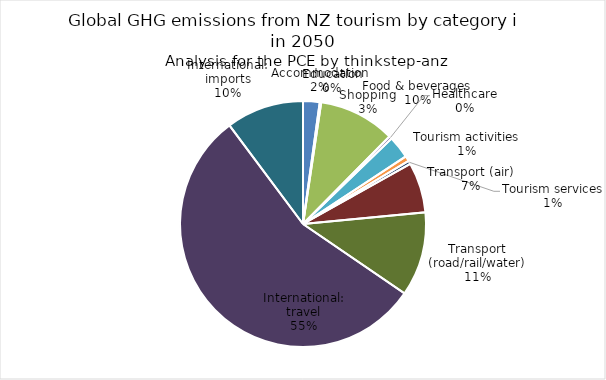
| Category | Series 0 |
|---|---|
| Accommodation | 253.34 |
| Education | 22.367 |
| Food & beverages | 1166.266 |
| Healthcare | 44.54 |
| Shopping | 344.253 |
| Tourism activities | 78.055 |
| Tourism services | 51.208 |
| Transport (air) | 771.339 |
| Transport (road/rail/water) | 1285.724 |
| International: travel | 6424.609 |
| International: imports | 1186.387 |